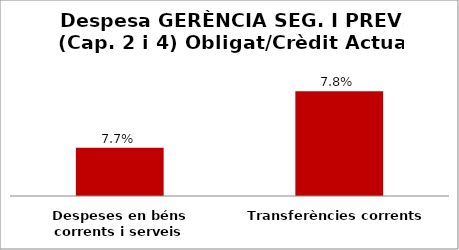
| Category | Series 0 |
|---|---|
| Despeses en béns corrents i serveis | 0.077 |
| Transferències corrents | 0.078 |